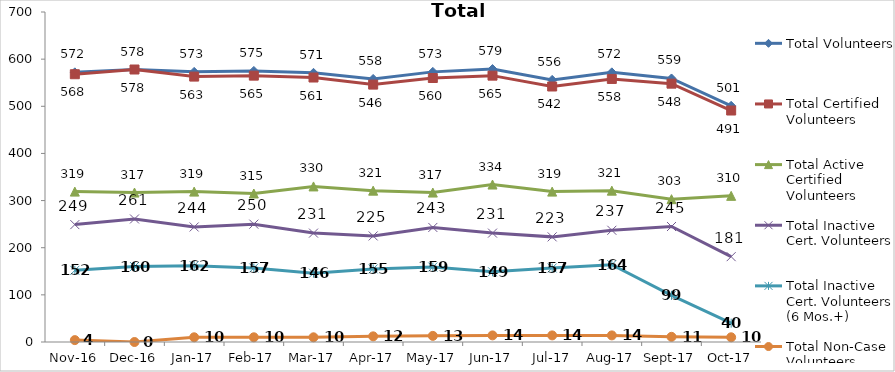
| Category | Total Volunteers | Total Certified Volunteers | Total Active Certified Volunteers | Total Inactive Cert. Volunteers | Total Inactive Cert. Volunteers (6 Mos.+) | Total Non-Case Volunteers |
|---|---|---|---|---|---|---|
| 2016-11-01 | 572 | 568 | 319 | 249 | 152 | 4 |
| 2016-12-01 | 578 | 578 | 317 | 261 | 160 | 0 |
| 2017-01-01 | 573 | 563 | 319 | 244 | 162 | 10 |
| 2017-02-01 | 575 | 565 | 315 | 250 | 157 | 10 |
| 2017-03-01 | 571 | 561 | 330 | 231 | 146 | 10 |
| 2017-04-01 | 558 | 546 | 321 | 225 | 155 | 12 |
| 2017-05-01 | 573 | 560 | 317 | 243 | 159 | 13 |
| 2017-06-01 | 579 | 565 | 334 | 231 | 149 | 14 |
| 2017-07-01 | 556 | 542 | 319 | 223 | 157 | 14 |
| 2017-08-01 | 572 | 558 | 321 | 237 | 164 | 14 |
| 2017-09-01 | 559 | 548 | 303 | 245 | 99 | 11 |
| 2017-10-01 | 501 | 491 | 310 | 181 | 40 | 10 |